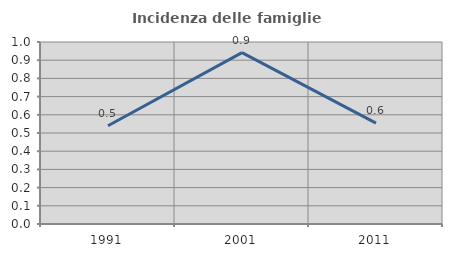
| Category | Incidenza delle famiglie numerose |
|---|---|
| 1991.0 | 0.54 |
| 2001.0 | 0.942 |
| 2011.0 | 0.554 |